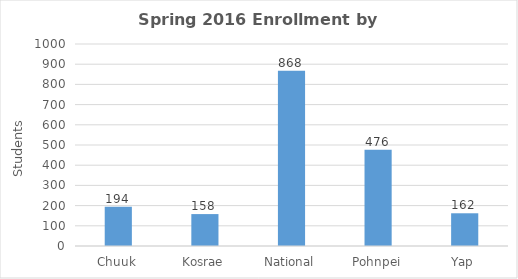
| Category | Series 0 |
|---|---|
| Chuuk | 194 |
| Kosrae | 158 |
| National | 868 |
| Pohnpei | 476 |
| Yap | 162 |